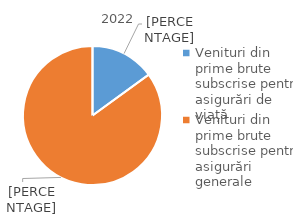
| Category | 2022 |
|---|---|
| Venituri din prime brute subscrise pentru asigurări de viață | 15 |
| Venituri din prime brute subscrise pentru asigurări generale | 85 |